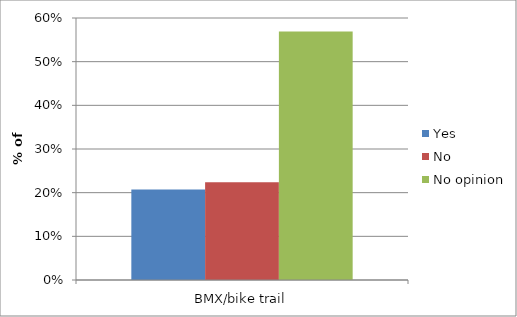
| Category | Yes | No | No opinion |
|---|---|---|---|
| BMX/bike trail | 0.207 | 0.224 | 0.569 |